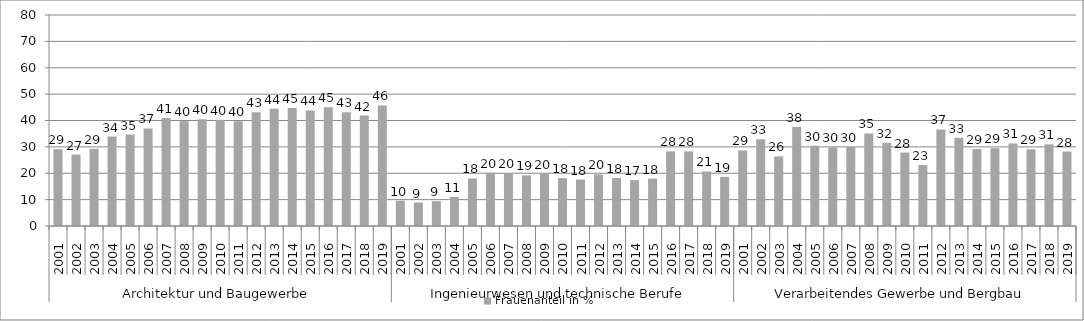
| Category | Frauenanteil in % |
|---|---|
| 0 | 29.132 |
| 1 | 27.089 |
| 2 | 29.275 |
| 3 | 33.932 |
| 4 | 34.645 |
| 5 | 36.994 |
| 6 | 40.991 |
| 7 | 39.683 |
| 8 | 40.455 |
| 9 | 40.267 |
| 10 | 39.69 |
| 11 | 43.156 |
| 12 | 44.408 |
| 13 | 44.746 |
| 14 | 43.822 |
| 15 | 45.029 |
| 16 | 43.114 |
| 17 | 41.858 |
| 18 | 45.701 |
| 19 | 9.606 |
| 20 | 8.901 |
| 21 | 9.419 |
| 22 | 11.029 |
| 23 | 18.01 |
| 24 | 20.203 |
| 25 | 20.113 |
| 26 | 19.191 |
| 27 | 19.716 |
| 28 | 18.143 |
| 29 | 17.596 |
| 30 | 19.572 |
| 31 | 18.208 |
| 32 | 17.391 |
| 33 | 17.956 |
| 34 | 28.295 |
| 35 | 28.294 |
| 36 | 20.673 |
| 37 | 18.641 |
| 38 | 28.636 |
| 39 | 32.889 |
| 40 | 26.394 |
| 41 | 37.546 |
| 42 | 30.435 |
| 43 | 29.825 |
| 44 | 29.907 |
| 45 | 35.115 |
| 46 | 31.548 |
| 47 | 27.848 |
| 48 | 23.125 |
| 49 | 36.612 |
| 50 | 33.491 |
| 51 | 29.183 |
| 52 | 29.496 |
| 53 | 31.295 |
| 54 | 29.104 |
| 55 | 30.943 |
| 56 | 28.226 |